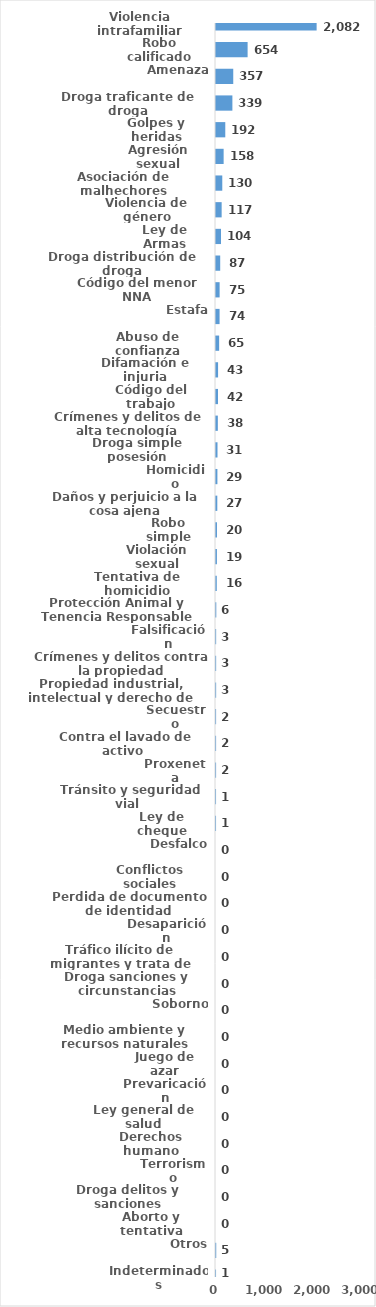
| Category | Series 0 |
|---|---|
| Violencia intrafamiliar | 2082 |
| Robo calificado | 654 |
| Amenaza | 357 |
| Droga traficante de droga | 339 |
| Golpes y heridas | 192 |
| Agresión sexual | 158 |
| Asociación de malhechores | 130 |
| Violencia de género | 117 |
| Ley de Armas | 104 |
| Droga distribución de droga | 87 |
| Código del menor NNA | 75 |
| Estafa | 74 |
| Abuso de confianza | 65 |
| Difamación e injuria | 43 |
| Código del trabajo | 42 |
| Crímenes y delitos de alta tecnología | 38 |
| Droga simple posesión | 31 |
| Homicidio | 29 |
| Daños y perjuicio a la cosa ajena | 27 |
| Robo simple | 20 |
| Violación sexual | 19 |
| Tentativa de homicidio | 16 |
| Protección Animal y Tenencia Responsable | 6 |
| Falsificación | 3 |
| Crímenes y delitos contra la propiedad | 3 |
| Propiedad industrial, intelectual y derecho de autor | 3 |
| Secuestro | 2 |
| Contra el lavado de activo  | 2 |
| Proxeneta | 2 |
| Tránsito y seguridad vial  | 1 |
| Ley de cheque | 1 |
| Desfalco | 0 |
| Conflictos sociales | 0 |
| Perdida de documento de identidad | 0 |
| Desaparición | 0 |
| Tráfico ilícito de migrantes y trata de personas | 0 |
| Droga sanciones y circunstancias agravantes | 0 |
| Soborno | 0 |
| Medio ambiente y recursos naturales | 0 |
| Juego de azar | 0 |
| Prevaricación | 0 |
| Ley general de salud | 0 |
| Derechos humano | 0 |
| Terrorismo | 0 |
| Droga delitos y sanciones | 0 |
| Aborto y tentativa | 0 |
| Otros | 5 |
| Indeterminados | 1 |